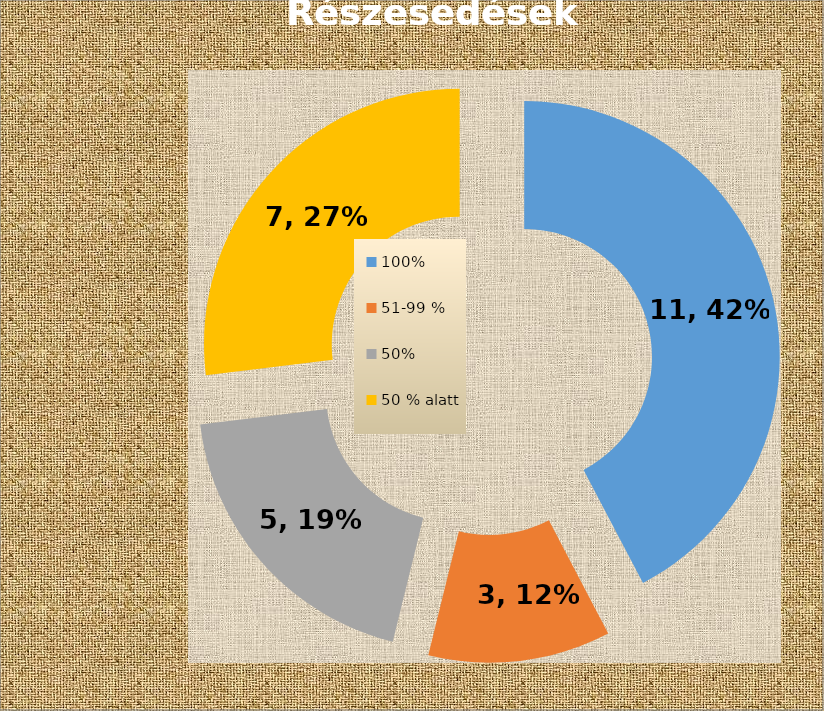
| Category | Series 0 |
|---|---|
| 100% | 11 |
| 51-99 % | 3 |
| 50% | 5 |
| 50 % alatt | 7 |